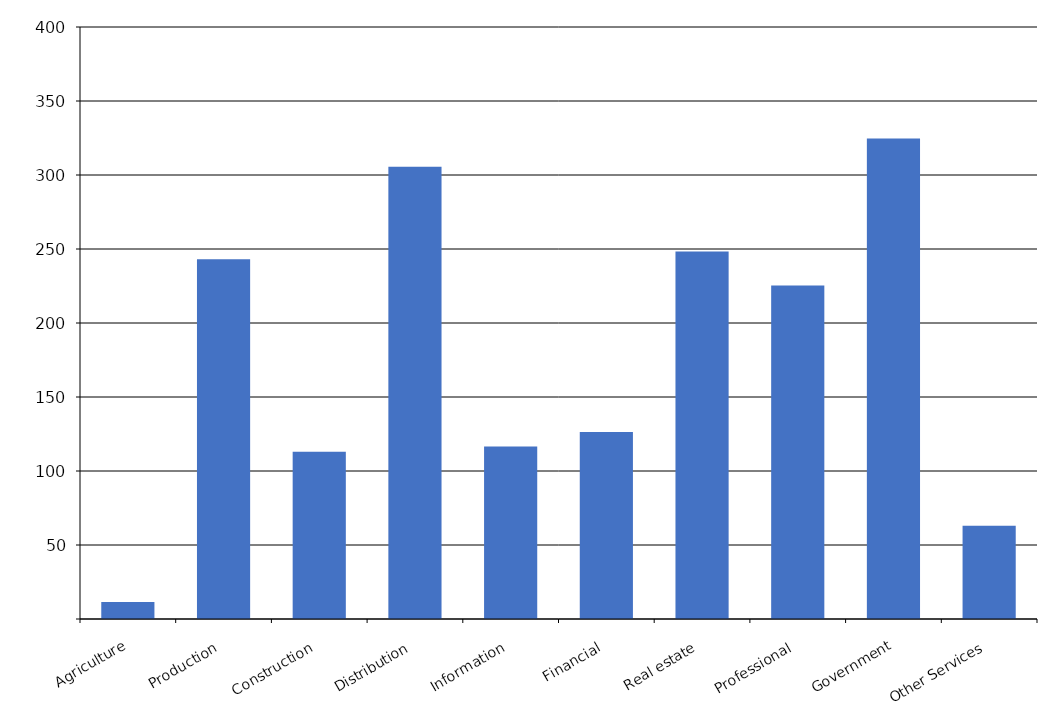
| Category | Series 0 |
|---|---|
| Agriculture | 11493 |
| Production | 243053 |
| Construction | 113052 |
| Distribution | 305592 |
| Information | 116629 |
| Financial | 126297 |
| Real estate | 248250 |
| Professional | 225377 |
| Government | 324683 |
| Other Services | 62940 |